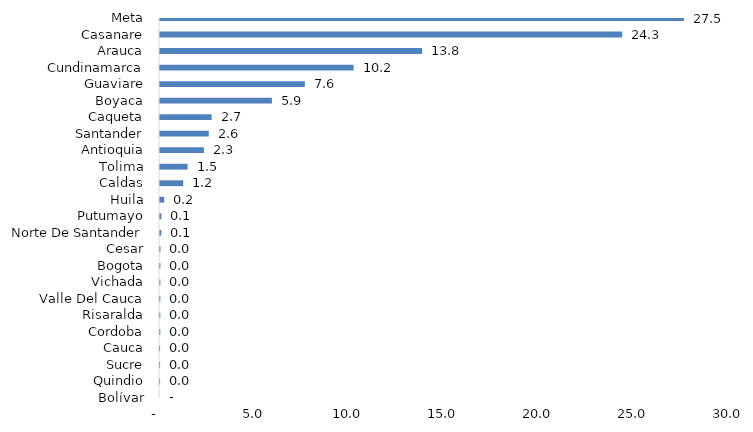
| Category | Series 0 |
|---|---|
| Bolívar | 0 |
| Quindio | 0.004 |
| Sucre | 0.004 |
| Cauca | 0.005 |
| Cordoba | 0.016 |
| Risaralda | 0.016 |
| Valle Del Cauca | 0.018 |
| Vichada | 0.02 |
| Bogota | 0.021 |
| Cesar | 0.025 |
| Norte De Santander | 0.07 |
| Putumayo | 0.074 |
| Huila | 0.225 |
| Caldas | 1.219 |
| Tolima | 1.452 |
| Antioquia | 2.306 |
| Santander | 2.563 |
| Caqueta | 2.711 |
| Boyaca | 5.88 |
| Guaviare | 7.609 |
| Cundinamarca | 10.171 |
| Arauca | 13.77 |
| Casanare | 24.286 |
| Meta | 27.53 |